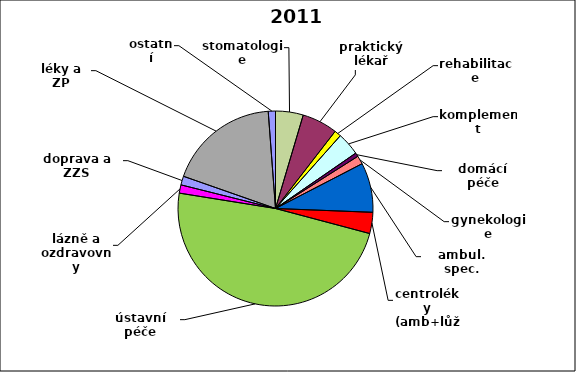
| Category | Series 0 |
|---|---|
| stomatologie | 0.046 |
| praktický lékař | 0.059 |
| rehabilitace | 0.011 |
| komplement | 0.038 |
| domácí péče | 0.006 |
| gynekologie | 0.014 |
| ambul. spec. | 0.082 |
| centroléky (amb+lůž) | 0.035 |
| ústavní péče | 0.484 |
| lázně a ozdravovny | 0.014 |
| doprava a ZZS | 0.015 |
| léky a ZP | 0.184 |
| ostatní | 0.012 |